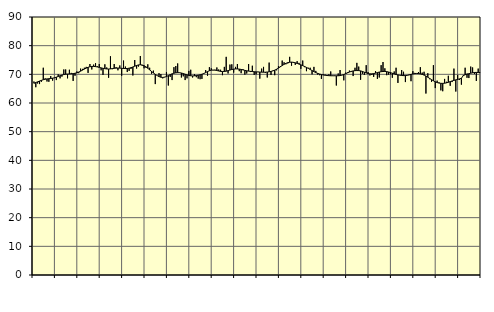
| Category | Piggar | Series 1 |
|---|---|---|
| nan | 67.5 | 66.87 |
| 1.0 | 65.5 | 67.16 |
| 1.0 | 66.8 | 67.38 |
| 1.0 | 66.6 | 67.65 |
| 1.0 | 67.4 | 67.9 |
| 1.0 | 72.3 | 68.12 |
| 1.0 | 68.6 | 68.29 |
| 1.0 | 67.5 | 68.39 |
| 1.0 | 67.4 | 68.48 |
| 1.0 | 69.4 | 68.55 |
| 1.0 | 67.8 | 68.65 |
| 1.0 | 68.7 | 68.8 |
| nan | 68 | 69.01 |
| 2.0 | 70 | 69.25 |
| 2.0 | 68.6 | 69.51 |
| 2.0 | 69.2 | 69.75 |
| 2.0 | 71.7 | 69.93 |
| 2.0 | 71.7 | 70.04 |
| 2.0 | 68.6 | 70.1 |
| 2.0 | 71.6 | 70.13 |
| 2.0 | 70.5 | 70.18 |
| 2.0 | 67.7 | 70.25 |
| 2.0 | 69.5 | 70.37 |
| 2.0 | 71 | 70.56 |
| nan | 70.4 | 70.8 |
| 3.0 | 72 | 71.1 |
| 3.0 | 71.9 | 71.46 |
| 3.0 | 72.3 | 71.83 |
| 3.0 | 72.6 | 72.17 |
| 3.0 | 70.5 | 72.45 |
| 3.0 | 73.6 | 72.65 |
| 3.0 | 71.7 | 72.76 |
| 3.0 | 73.4 | 72.77 |
| 3.0 | 73.9 | 72.69 |
| 3.0 | 72.8 | 72.57 |
| 3.0 | 73.6 | 72.42 |
| nan | 71.4 | 72.25 |
| 4.0 | 69.8 | 72.1 |
| 4.0 | 73.5 | 71.97 |
| 4.0 | 72.4 | 71.88 |
| 4.0 | 68.8 | 71.86 |
| 4.0 | 76.3 | 71.91 |
| 4.0 | 71.8 | 72 |
| 4.0 | 73.6 | 72.1 |
| 4.0 | 72.5 | 72.17 |
| 4.0 | 71.4 | 72.2 |
| 4.0 | 73.1 | 72.17 |
| 4.0 | 69.5 | 72.1 |
| nan | 74.8 | 72.03 |
| 5.0 | 72.7 | 72.01 |
| 5.0 | 70.8 | 72.04 |
| 5.0 | 71.2 | 72.15 |
| 5.0 | 71.9 | 72.32 |
| 5.0 | 69.6 | 72.57 |
| 5.0 | 75 | 72.84 |
| 5.0 | 72 | 73.09 |
| 5.0 | 72.7 | 73.28 |
| 5.0 | 76.4 | 73.34 |
| 5.0 | 73 | 73.26 |
| 5.0 | 72.1 | 73.02 |
| nan | 72.3 | 72.62 |
| 6.0 | 73.5 | 72.11 |
| 6.0 | 72.3 | 71.55 |
| 6.0 | 70.2 | 71 |
| 6.0 | 71.3 | 70.48 |
| 6.0 | 66.6 | 70 |
| 6.0 | 69.6 | 69.57 |
| 6.0 | 70.4 | 69.21 |
| 6.0 | 70.1 | 68.99 |
| 6.0 | 68.6 | 68.92 |
| 6.0 | 69.1 | 69.01 |
| 6.0 | 70.8 | 69.24 |
| nan | 66.1 | 69.56 |
| 7.0 | 69.1 | 69.89 |
| 7.0 | 68 | 70.17 |
| 7.0 | 72.5 | 70.39 |
| 7.0 | 72.9 | 70.53 |
| 7.0 | 73.8 | 70.59 |
| 7.0 | 70.5 | 70.57 |
| 7.0 | 68.9 | 70.46 |
| 7.0 | 69.3 | 70.27 |
| 7.0 | 68 | 70.04 |
| 7.0 | 68.6 | 69.82 |
| 7.0 | 71.2 | 69.62 |
| nan | 71.6 | 69.49 |
| 8.0 | 68.9 | 69.45 |
| 8.0 | 70.1 | 69.49 |
| 8.0 | 69 | 69.57 |
| 8.0 | 68.5 | 69.69 |
| 8.0 | 68.3 | 69.83 |
| 8.0 | 68.4 | 70.03 |
| 8.0 | 70.4 | 70.29 |
| 8.0 | 71.5 | 70.62 |
| 8.0 | 69.5 | 70.96 |
| 8.0 | 72.5 | 71.26 |
| 8.0 | 72.1 | 71.45 |
| nan | 71.4 | 71.51 |
| 9.0 | 71.6 | 71.46 |
| 9.0 | 72.4 | 71.33 |
| 9.0 | 71.7 | 71.16 |
| 9.0 | 71.6 | 71.03 |
| 9.0 | 69.7 | 70.96 |
| 9.0 | 72.6 | 70.98 |
| 9.0 | 76.1 | 71.1 |
| 9.0 | 70.3 | 71.29 |
| 9.0 | 73.4 | 71.49 |
| 9.0 | 73.5 | 71.68 |
| 9.0 | 70.6 | 71.81 |
| nan | 72.6 | 71.89 |
| 10.0 | 73.6 | 71.89 |
| 10.0 | 71.1 | 71.83 |
| 10.0 | 70.4 | 71.71 |
| 10.0 | 71.8 | 71.55 |
| 10.0 | 69.9 | 71.38 |
| 10.0 | 70.3 | 71.24 |
| 10.0 | 73.6 | 71.13 |
| 10.0 | 70.8 | 71.04 |
| 10.0 | 73 | 70.97 |
| 10.0 | 69.8 | 70.91 |
| 10.0 | 70 | 70.86 |
| nan | 70.9 | 70.82 |
| 11.0 | 68.5 | 70.79 |
| 11.0 | 72 | 70.76 |
| 11.0 | 72.6 | 70.74 |
| 11.0 | 70.5 | 70.75 |
| 11.0 | 68.9 | 70.8 |
| 11.0 | 74.1 | 70.89 |
| 11.0 | 69.8 | 71.02 |
| 11.0 | 71.3 | 71.2 |
| 11.0 | 69.7 | 71.46 |
| 11.0 | 71.4 | 71.79 |
| 11.0 | 72.8 | 72.18 |
| nan | 72.9 | 72.63 |
| 12.0 | 74.8 | 73.07 |
| 12.0 | 74.2 | 73.49 |
| 12.0 | 73.5 | 73.83 |
| 12.0 | 73.8 | 74.08 |
| 12.0 | 76.1 | 74.22 |
| 12.0 | 73 | 74.26 |
| 12.0 | 74 | 74.18 |
| 12.0 | 73.3 | 74.02 |
| 12.0 | 74.6 | 73.81 |
| 12.0 | 74 | 73.57 |
| 12.0 | 71.9 | 73.31 |
| nan | 74.8 | 73.03 |
| 13.0 | 72.5 | 72.74 |
| 13.0 | 71.1 | 72.41 |
| 13.0 | 72.3 | 72.06 |
| 13.0 | 72.3 | 71.69 |
| 13.0 | 70 | 71.31 |
| 13.0 | 72.6 | 70.93 |
| 13.0 | 71.2 | 70.61 |
| 13.0 | 69.9 | 70.34 |
| 13.0 | 69.7 | 70.11 |
| 13.0 | 68.4 | 69.92 |
| 13.0 | 70 | 69.77 |
| nan | 69.9 | 69.67 |
| 14.0 | 69.5 | 69.59 |
| 14.0 | 70 | 69.54 |
| 14.0 | 71 | 69.5 |
| 14.0 | 69.6 | 69.49 |
| 14.0 | 69.6 | 69.49 |
| 14.0 | 66.1 | 69.49 |
| 14.0 | 70.3 | 69.5 |
| 14.0 | 71.5 | 69.56 |
| 14.0 | 69.8 | 69.71 |
| 14.0 | 67.9 | 69.94 |
| 14.0 | 70.6 | 70.22 |
| nan | 70.7 | 70.52 |
| 15.0 | 71.3 | 70.79 |
| 15.0 | 70.8 | 71.02 |
| 15.0 | 69.4 | 71.19 |
| 15.0 | 72.3 | 71.29 |
| 15.0 | 74 | 71.32 |
| 15.0 | 72.7 | 71.3 |
| 15.0 | 68.1 | 71.2 |
| 15.0 | 70.2 | 71 |
| 15.0 | 69.8 | 70.74 |
| 15.0 | 73.2 | 70.48 |
| 15.0 | 70.8 | 70.28 |
| nan | 69.6 | 70.16 |
| 16.0 | 69.8 | 70.16 |
| 16.0 | 69.1 | 70.26 |
| 16.0 | 71.1 | 70.42 |
| 16.0 | 68.4 | 70.61 |
| 16.0 | 68.9 | 70.79 |
| 16.0 | 73.2 | 70.92 |
| 16.0 | 74.3 | 70.99 |
| 16.0 | 72.1 | 71 |
| 16.0 | 69.7 | 70.94 |
| 16.0 | 69.9 | 70.8 |
| 16.0 | 70 | 70.6 |
| nan | 68.8 | 70.38 |
| 17.0 | 71 | 70.15 |
| 17.0 | 72.3 | 69.95 |
| 17.0 | 67 | 69.79 |
| 17.0 | 69.7 | 69.67 |
| 17.0 | 71.5 | 69.6 |
| 17.0 | 70.9 | 69.55 |
| 17.0 | 67.3 | 69.57 |
| 17.0 | 69.7 | 69.64 |
| 17.0 | 69.9 | 69.78 |
| 17.0 | 67.6 | 69.97 |
| 17.0 | 71.1 | 70.13 |
| nan | 70.5 | 70.25 |
| 18.0 | 70.4 | 70.31 |
| 18.0 | 70.8 | 70.27 |
| 18.0 | 72.5 | 70.16 |
| 18.0 | 70.6 | 69.99 |
| 18.0 | 70.9 | 69.74 |
| 18.0 | 63.3 | 69.41 |
| 18.0 | 70.4 | 69 |
| 18.0 | 68.3 | 68.57 |
| 18.0 | 67.4 | 68.14 |
| 18.0 | 73.2 | 67.74 |
| 18.0 | 65.2 | 67.4 |
| nan | 67.8 | 67.13 |
| 19.0 | 67.2 | 66.95 |
| 19.0 | 64.4 | 66.86 |
| 19.0 | 64.1 | 66.85 |
| 19.0 | 68.4 | 66.9 |
| 19.0 | 67.4 | 67.03 |
| 19.0 | 69.5 | 67.22 |
| 19.0 | 66 | 67.47 |
| 19.0 | 67.3 | 67.69 |
| 19.0 | 72 | 67.89 |
| 19.0 | 64 | 68.07 |
| 19.0 | 69.8 | 68.23 |
| nan | 68.1 | 68.41 |
| 20.0 | 66.4 | 68.63 |
| 20.0 | 69.8 | 69.56 |
| 20.0 | 72.3 | 69.85 |
| 20.0 | 68.8 | 70.13 |
| 20.0 | 68.7 | 70.2 |
| 20.0 | 72.7 | 70.4 |
| 20.0 | 72.4 | 70.54 |
| 20.0 | 70.1 | 70.64 |
| 20.0 | 67.7 | 70.67 |
| 20.0 | 72 | 70.65 |
| 20.0 | 70.7 | 70.62 |